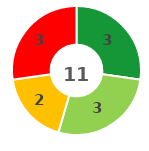
| Category | Series 0 |
|---|---|
| 0 | 3 |
| 1 | 3 |
| 2 | 2 |
| 3 | 3 |
| 4 | 0 |